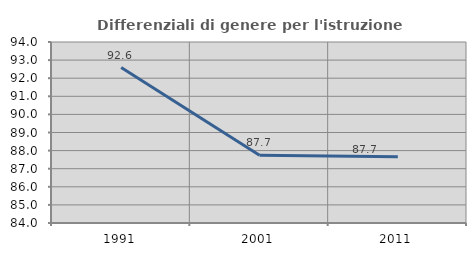
| Category | Differenziali di genere per l'istruzione superiore |
|---|---|
| 1991.0 | 92.587 |
| 2001.0 | 87.747 |
| 2011.0 | 87.657 |